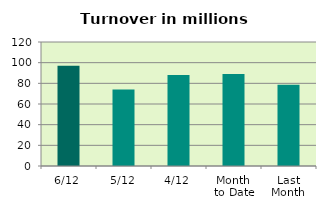
| Category | Series 0 |
|---|---|
| 6/12 | 96.994 |
| 5/12 | 74.015 |
| 4/12 | 88.033 |
| Month 
to Date | 89.039 |
| Last
Month | 78.658 |